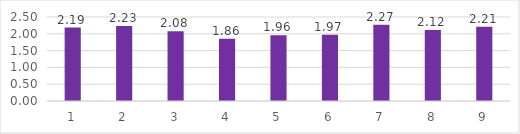
| Category | Series 0 |
|---|---|
| 0 | 2.185 |
| 1 | 2.23 |
| 2 | 2.075 |
| 3 | 1.855 |
| 4 | 1.96 |
| 5 | 1.97 |
| 6 | 2.27 |
| 7 | 2.115 |
| 8 | 2.21 |